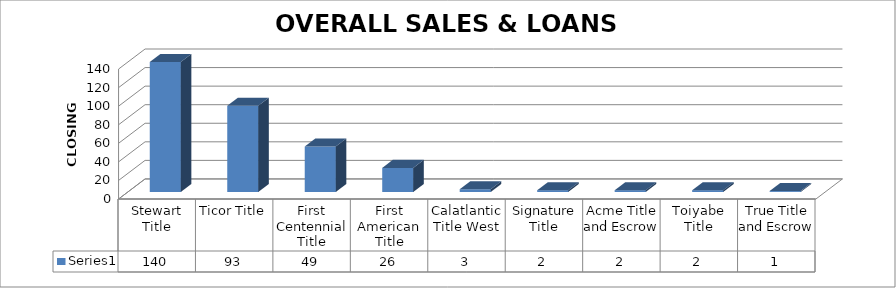
| Category | Series 0 |
|---|---|
| Stewart Title | 140 |
| Ticor Title | 93 |
| First Centennial Title | 49 |
| First American Title | 26 |
| Calatlantic Title West | 3 |
| Signature Title | 2 |
| Acme Title and Escrow | 2 |
| Toiyabe Title | 2 |
| True Title and Escrow | 1 |